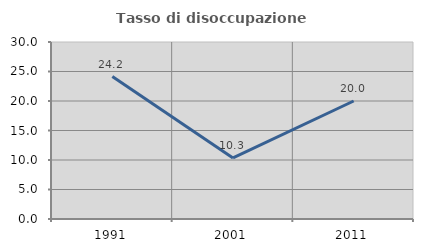
| Category | Tasso di disoccupazione giovanile  |
|---|---|
| 1991.0 | 24.153 |
| 2001.0 | 10.345 |
| 2011.0 | 20 |